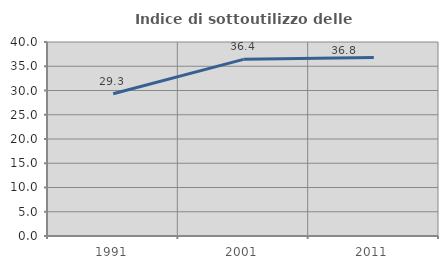
| Category | Indice di sottoutilizzo delle abitazioni  |
|---|---|
| 1991.0 | 29.324 |
| 2001.0 | 36.426 |
| 2011.0 | 36.804 |